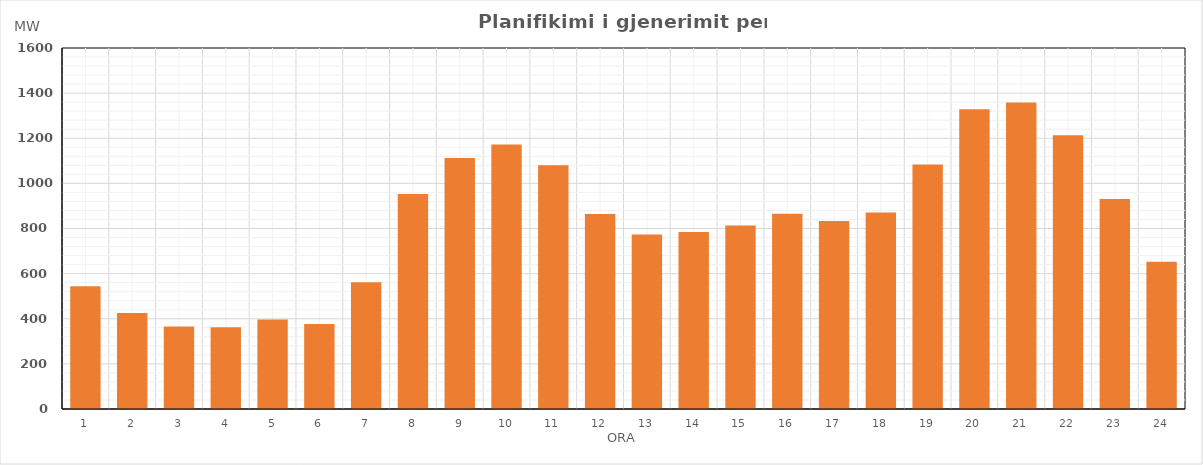
| Category | Max (MW) |
|---|---|
| 0 | 544.21 |
| 1 | 424.94 |
| 2 | 365.13 |
| 3 | 362.83 |
| 4 | 396.72 |
| 5 | 376.52 |
| 6 | 561.81 |
| 7 | 953.34 |
| 8 | 1112.8 |
| 9 | 1172.8 |
| 10 | 1080.64 |
| 11 | 863.93 |
| 12 | 773.76 |
| 13 | 784.43 |
| 14 | 813.66 |
| 15 | 865.47 |
| 16 | 832.96 |
| 17 | 870.59 |
| 18 | 1083.51 |
| 19 | 1328.12 |
| 20 | 1358.33 |
| 21 | 1213.83 |
| 22 | 930.63 |
| 23 | 652.47 |